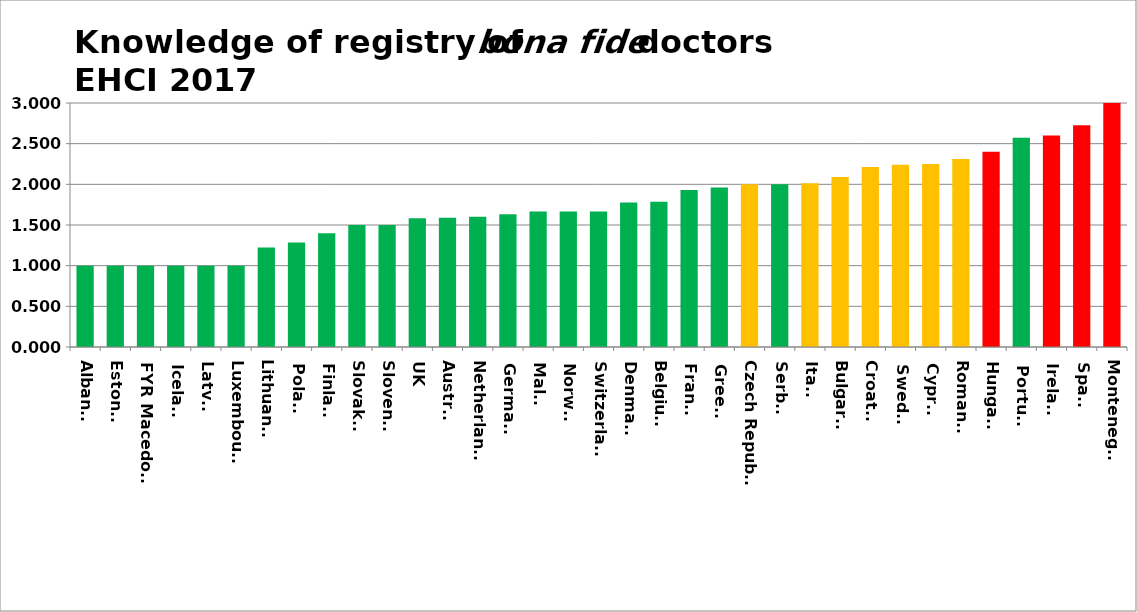
| Category | Series 0 |
|---|---|
| Albania | 1 |
| Estonia | 1 |
| FYR Macedonia | 1 |
| Iceland | 1 |
| Latvia | 1 |
| Luxembourg | 1 |
| Lithuania | 1.222 |
| Poland | 1.286 |
| Finland | 1.4 |
| Slovakia | 1.5 |
| Slovenia | 1.5 |
| UK | 1.582 |
| Austria | 1.588 |
| Netherlands | 1.6 |
| Germany | 1.633 |
| Malta | 1.667 |
| Norway | 1.667 |
| Switzerland | 1.667 |
| Denmark | 1.778 |
| Belgium | 1.786 |
| France | 1.931 |
| Greece | 1.96 |
| Czech Republic | 2 |
| Serbia | 2 |
| Italy | 2.014 |
| Bulgaria | 2.091 |
| Croatia | 2.214 |
| Sweden | 2.24 |
| Cyprus | 2.25 |
| Romania | 2.312 |
| Hungary | 2.4 |
| Portugal | 2.571 |
| Ireland | 2.6 |
| Spain | 2.726 |
| Montenegro | 3 |